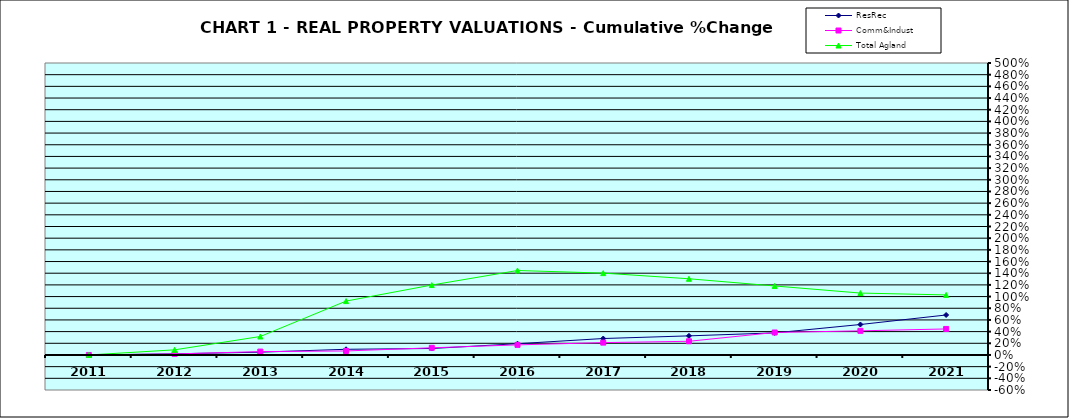
| Category | ResRec | Comm&Indust | Total Agland |
|---|---|---|---|
| 2011.0 | 0 | 0 | 0 |
| 2012.0 | 0.02 | 0.017 | 0.088 |
| 2013.0 | 0.048 | 0.058 | 0.316 |
| 2014.0 | 0.097 | 0.068 | 0.923 |
| 2015.0 | 0.111 | 0.123 | 1.198 |
| 2016.0 | 0.193 | 0.173 | 1.447 |
| 2017.0 | 0.282 | 0.211 | 1.402 |
| 2018.0 | 0.327 | 0.234 | 1.305 |
| 2019.0 | 0.378 | 0.385 | 1.181 |
| 2020.0 | 0.521 | 0.413 | 1.06 |
| 2021.0 | 0.684 | 0.445 | 1.028 |